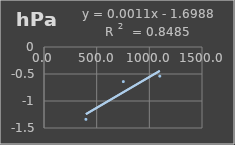
| Category | Presión Admosferica |
|---|---|
| 397.9 | -1.34 |
| 753.2 | -0.641 |
| 1099.2 | -0.54 |